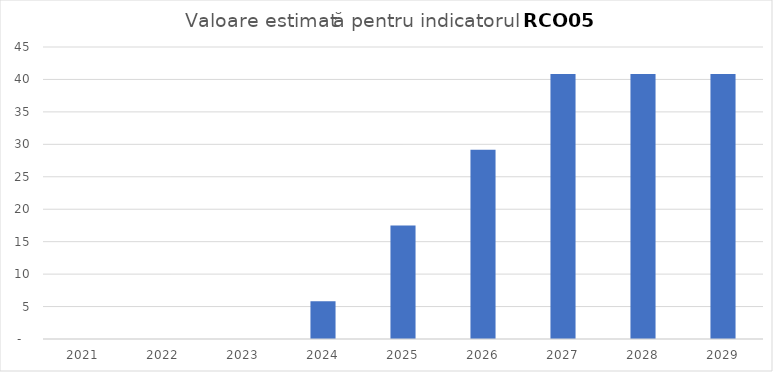
| Category | Series 0 |
|---|---|
| 2021.0 | 0 |
| 2022.0 | 0 |
| 2023.0 | 0 |
| 2024.0 | 5.834 |
| 2025.0 | 17.503 |
| 2026.0 | 29.171 |
| 2027.0 | 40.839 |
| 2028.0 | 40.839 |
| 2029.0 | 40.839 |